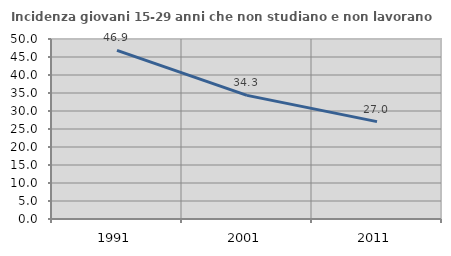
| Category | Incidenza giovani 15-29 anni che non studiano e non lavorano  |
|---|---|
| 1991.0 | 46.853 |
| 2001.0 | 34.341 |
| 2011.0 | 27.044 |